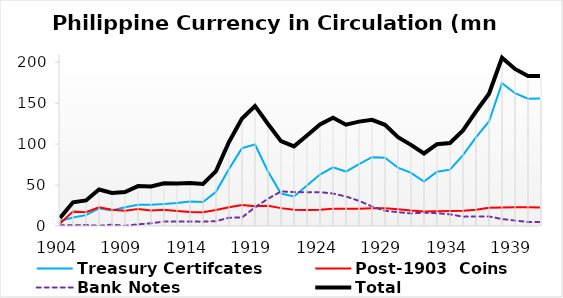
| Category | Treasury Certifcates | Post-1903  Coins | Bank Notes | Total |
|---|---|---|---|---|
| 1904.0 | 6000000 | 3057127 | 855367.5 | 9912494.5 |
| 1905.0 | 10450000 | 17710667 | 784287 | 28944954 |
| 1906.0 | 13231374.5 | 16799037.1 | 1178625.4 | 31209037 |
| 1907.0 | 21540708 | 22785860.25 | 275596.2 | 44602164.45 |
| 1908.0 | 18883699 | 19811012.04 | 1643271 | 40337982.04 |
| 1909.0 | 22797454 | 18532024.59 | 199129.15 | 41528607.74 |
| 1910.0 | 26041840 | 20674773.81 | 2038083.55 | 48754697.36 |
| 1911.0 | 25804534 | 19050704.39 | 3300348.76 | 48155587.15 |
| 1912.0 | 26788055.5 | 19819923.35 | 5447914.12 | 52055892.97 |
| 1913.0 | 28188662 | 18412206.92 | 5433519.8 | 52034388.72 |
| 1914.0 | 30025914 | 17144331.93 | 5404871.81 | 52575117.74 |
| 1915.0 | 29286856 | 16693915.76 | 5304135 | 51284906.76 |
| 1916.0 | 41775333 | 19442528.54 | 5841327.5 | 67059189.04 |
| 1917.0 | 69511699 | 22931257.07 | 10137357.5 | 102580313.57 |
| 1918.0 | 95112523 | 25669147.88 | 10370212.15 | 131151883.03 |
| 1919.0 | 99529635 | 24178945.01 | 22868376.1 | 146576956.11 |
| 1920.0 | 66475215 | 24745082.68 | 33268941.95 | 124489239.63 |
| 1921.0 | 39611616.3 | 21812451.85 | 42237751.75 | 103661819.9 |
| 1922.0 | 36038354 | 19787533.495 | 41391580.2 | 97217467.695 |
| 1923.0 | 49470183 | 19590313.55 | 41328836.7 | 110389333.25 |
| 1924.0 | 62853582 | 19822339.49 | 41304059.2 | 123979980.69 |
| 1925.0 | 71646912 | 20933676.585 | 39620984.2 | 132201572.785 |
| 1926.0 | 66482914 | 21150672.025 | 36011683 | 123645269.025 |
| 1927.0 | 75557456 | 21210934.425 | 30677698.7 | 127446089.125 |
| 1928.0 | 84053032 | 21673280.55 | 23894245 | 129620557.55 |
| 1929.0 | 83378320 | 21580649.57 | 18579100.1 | 123538069.67 |
| 1930.0 | 71195566 | 20418479.32 | 16904359.1 | 108518404.42 |
| 1931.0 | 64781483 | 18940439.17 | 15324414.5 | 99046336.67 |
| 1932.0 | 54353268 | 17855195.03 | 16359296.67 | 88567759.7 |
| 1933.0 | 66325056 | 18029982.59 | 15587649.37 | 99942687.96 |
| 1934.0 | 68780395 | 18349110.07 | 14262914.87 | 101392419.94 |
| 1935.0 | 86548756 | 18770541.65 | 11403395.27 | 116722692.92 |
| 1936.0 | 108245557 | 19832398.95 | 11686065.42 | 139764021.37 |
| 1937.0 | 127609788 | 22202645.92 | 11676992.47 | 161489426.39 |
| 1938.0 | 174399322 | 22562309.57 | 8476260.47 | 205437892.04 |
| 1939.0 | 162078886 | 22990914.63 | 6682249.47 | 191752050.1 |
| 1940.0 | 155463462 | 22765947.91 | 4888238.47 | 183117648.38 |
| 1941.0 | 155800000 | 22497675 | 4802325 | 183100000 |